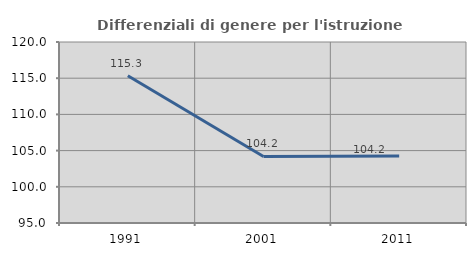
| Category | Differenziali di genere per l'istruzione superiore |
|---|---|
| 1991.0 | 115.346 |
| 2001.0 | 104.186 |
| 2011.0 | 104.24 |